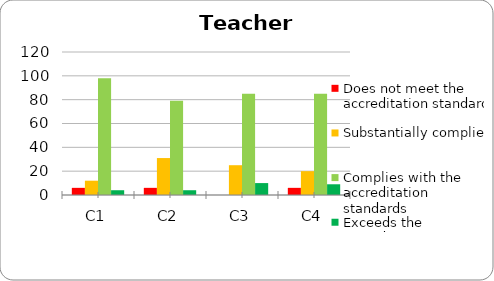
| Category | Does not meet the accreditation standard | Substantially complies | Complies with the accreditation standards | Exceeds the accreditation standards |
|---|---|---|---|---|
| C1 | 6 | 12 | 98 | 4 |
| C2 | 6 | 31 | 79 | 4 |
| C3 | 0 | 25 | 85 | 10 |
| C4 | 6 | 20 | 85 | 9 |